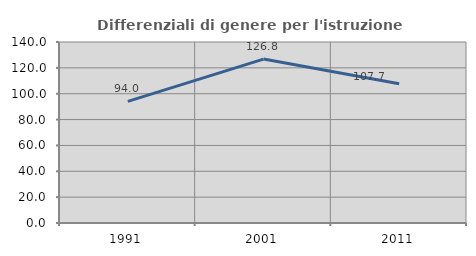
| Category | Differenziali di genere per l'istruzione superiore |
|---|---|
| 1991.0 | 94.041 |
| 2001.0 | 126.788 |
| 2011.0 | 107.699 |